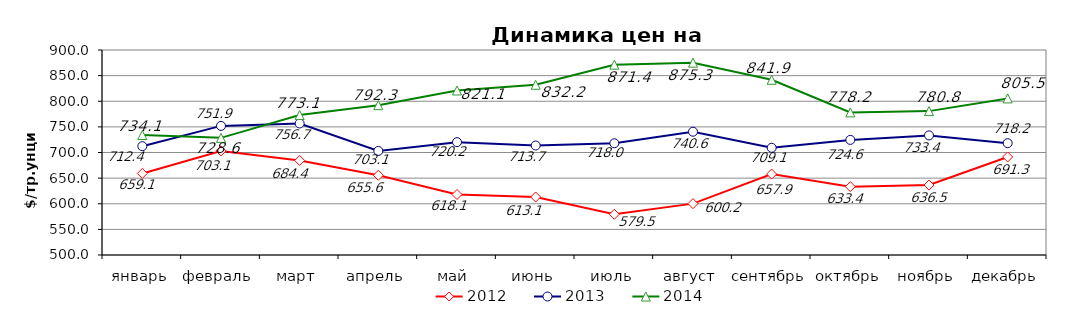
| Category | 2012 | 2013 | 2014 |
|---|---|---|---|
| январь | 659.14 | 712.36 | 734.14 |
| февраль | 703.05 | 751.93 | 728.55 |
| март | 684.36 | 756.65 | 773.07 |
| апрель | 655.58 | 703.05 | 792.33 |
| май | 618.05 | 720.19 | 821.05 |
| июнь | 613.11 | 713.68 | 832.19 |
| июль | 579.5 | 718.02 | 871.36 |
| август | 600.2 | 740.57 | 875.32 |
| сентябрь | 657.9 | 709.14 | 841.88 |
| октябрь | 633.37 | 724.61 | 778.24 |
| ноябрь | 636.5 | 733.36 | 780.75 |
| декабрь | 691.32 | 718.2 | 805.52 |